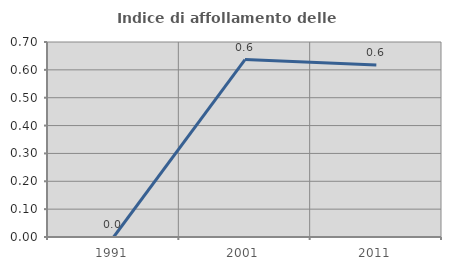
| Category | Indice di affollamento delle abitazioni  |
|---|---|
| 1991.0 | 0 |
| 2001.0 | 0.637 |
| 2011.0 | 0.617 |